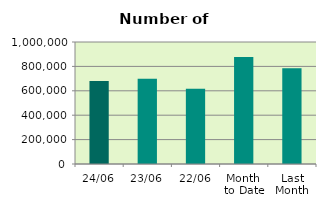
| Category | Series 0 |
|---|---|
| 24/06 | 680004 |
| 23/06 | 698684 |
| 22/06 | 617184 |
| Month 
to Date | 877422.444 |
| Last
Month | 785067 |